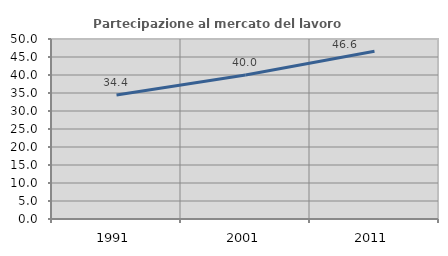
| Category | Partecipazione al mercato del lavoro  femminile |
|---|---|
| 1991.0 | 34.444 |
| 2001.0 | 40 |
| 2011.0 | 46.591 |